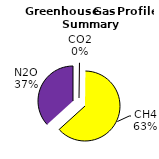
| Category | Series 0 |
|---|---|
| CO2 | 94.678 |
| CH4 | 28034.954 |
| N2O | 16329.065 |